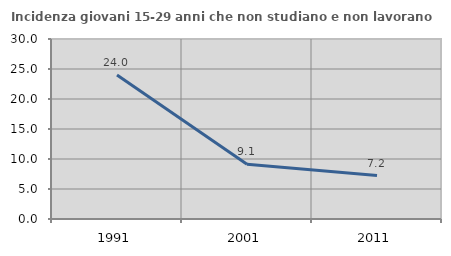
| Category | Incidenza giovani 15-29 anni che non studiano e non lavorano  |
|---|---|
| 1991.0 | 24 |
| 2001.0 | 9.136 |
| 2011.0 | 7.242 |